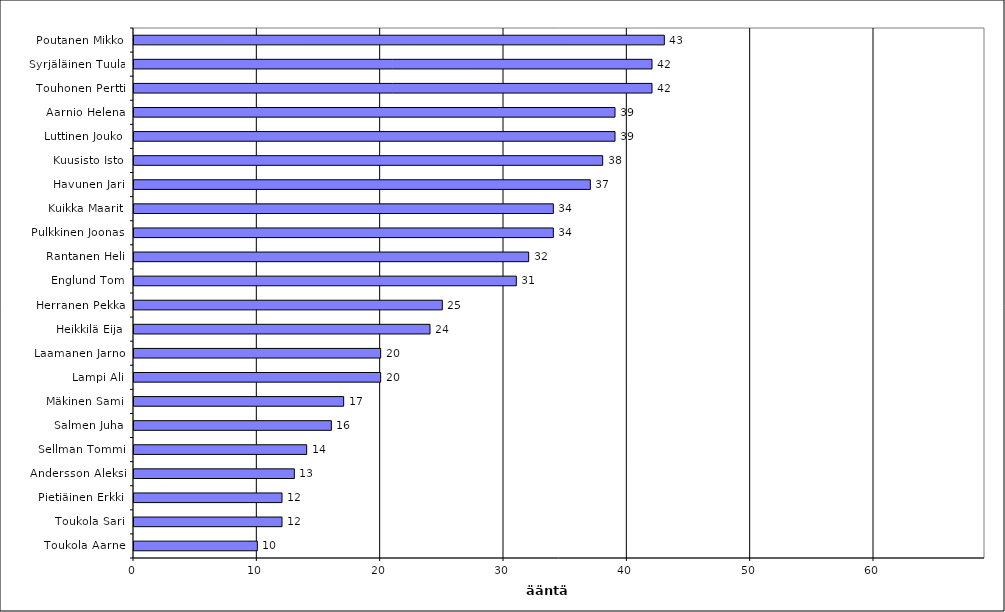
| Category | Series 0 |
|---|---|
| Poutanen Mikko | 43 |
| Syrjäläinen Tuula | 42 |
| Touhonen Pertti | 42 |
| Aarnio Helena | 39 |
| Luttinen Jouko | 39 |
| Kuusisto Isto | 38 |
| Havunen Jari | 37 |
| Kuikka Maarit | 34 |
| Pulkkinen Joonas | 34 |
| Rantanen Heli | 32 |
| Englund Tom | 31 |
| Herranen Pekka | 25 |
| Heikkilä Eija | 24 |
| Laamanen Jarno | 20 |
| Lampi Ali | 20 |
| Mäkinen Sami | 17 |
| Salmen Juha | 16 |
| Sellman Tommi | 14 |
| Andersson Aleksi | 13 |
| Pietiäinen Erkki | 12 |
| Toukola Sari | 12 |
| Toukola Aarne | 10 |